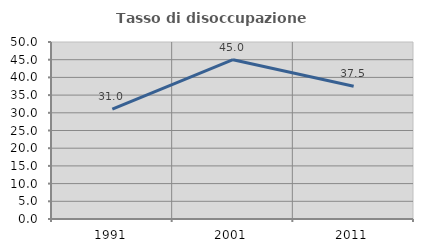
| Category | Tasso di disoccupazione giovanile  |
|---|---|
| 1991.0 | 31.034 |
| 2001.0 | 45 |
| 2011.0 | 37.5 |